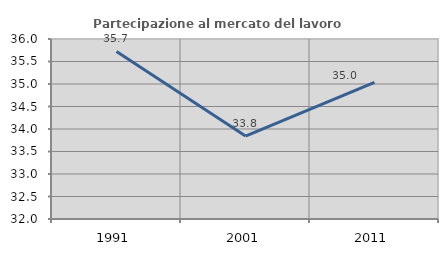
| Category | Partecipazione al mercato del lavoro  femminile |
|---|---|
| 1991.0 | 35.723 |
| 2001.0 | 33.843 |
| 2011.0 | 35.038 |